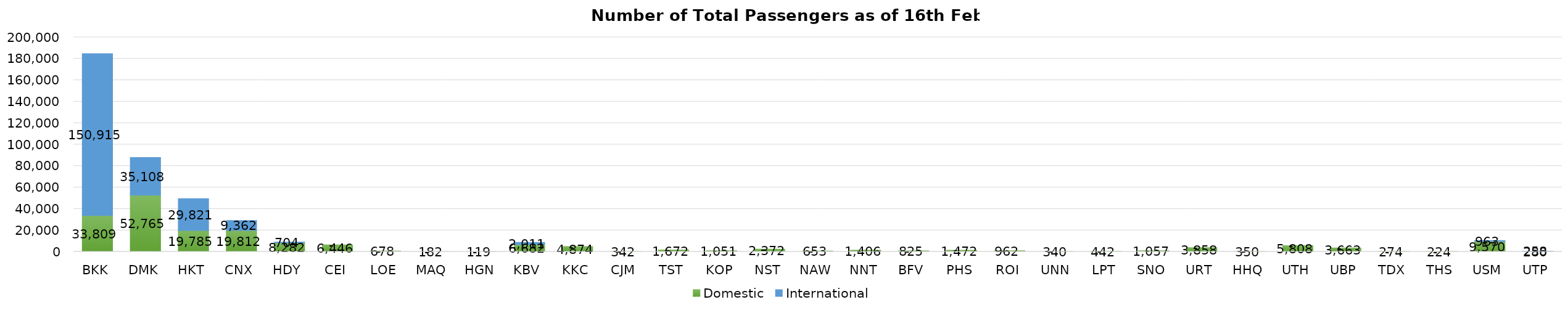
| Category | Domestic | International |
|---|---|---|
| BKK | 33809 | 150915 |
| DMK | 52765 | 35108 |
| HKT | 19785 | 29821 |
| CNX | 19812 | 9362 |
| HDY | 8282 | 704 |
| CEI | 6446 | 0 |
| LOE | 678 | 0 |
| MAQ | 182 | 0 |
| HGN | 119 | 0 |
| KBV | 6682 | 2011 |
| KKC | 4874 | 0 |
| CJM | 342 | 0 |
| TST | 1672 | 0 |
| KOP | 1051 | 0 |
| NST | 2372 | 0 |
| NAW | 653 | 0 |
| NNT | 1406 | 0 |
| BFV | 825 | 0 |
| PHS | 1472 | 0 |
| ROI | 962 | 0 |
| UNN | 340 | 0 |
| LPT | 442 | 0 |
| SNO | 1057 | 0 |
| URT | 3858 | 0 |
| HHQ | 350 | 0 |
| UTH | 5808 | 0 |
| UBP | 3663 | 0 |
| TDX | 274 | 0 |
| THS | 224 | 0 |
| USM | 9570 | 963 |
| UTP | 280 | 258 |